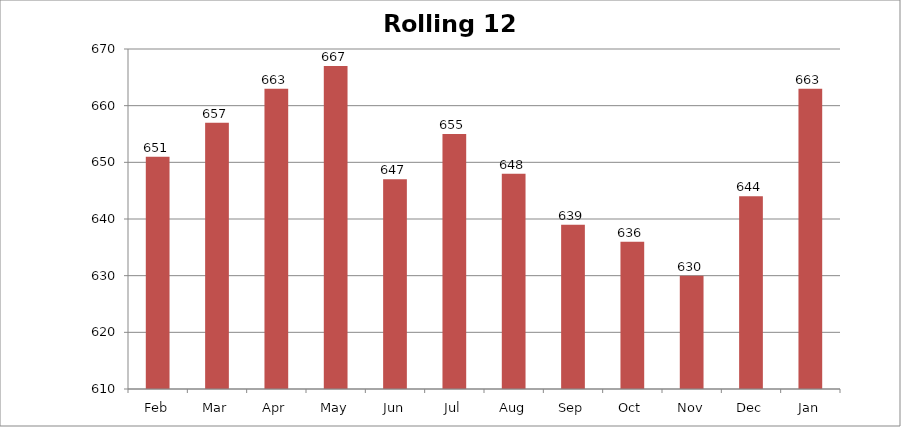
| Category | Rolling 12 Month |
|---|---|
| Feb | 651 |
| Mar | 657 |
| Apr | 663 |
| May | 667 |
| Jun | 647 |
| Jul | 655 |
| Aug | 648 |
| Sep | 639 |
| Oct | 636 |
| Nov | 630 |
| Dec | 644 |
| Jan | 663 |